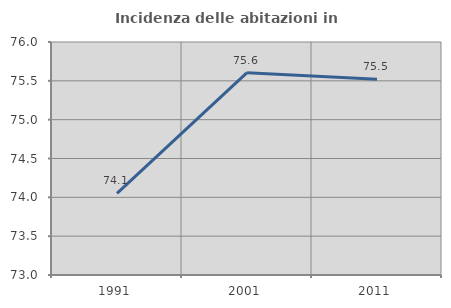
| Category | Incidenza delle abitazioni in proprietà  |
|---|---|
| 1991.0 | 74.051 |
| 2001.0 | 75.605 |
| 2011.0 | 75.52 |